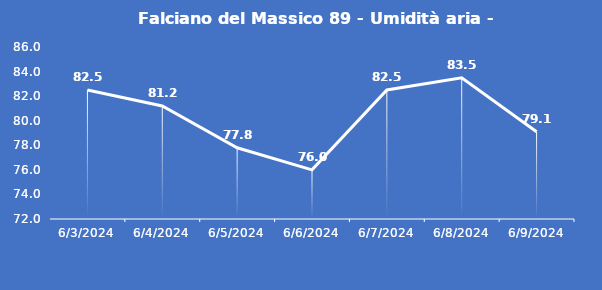
| Category | Falciano del Massico 89 - Umidità aria - Grezzo (%) |
|---|---|
| 6/3/24 | 82.5 |
| 6/4/24 | 81.2 |
| 6/5/24 | 77.8 |
| 6/6/24 | 76 |
| 6/7/24 | 82.5 |
| 6/8/24 | 83.5 |
| 6/9/24 | 79.1 |